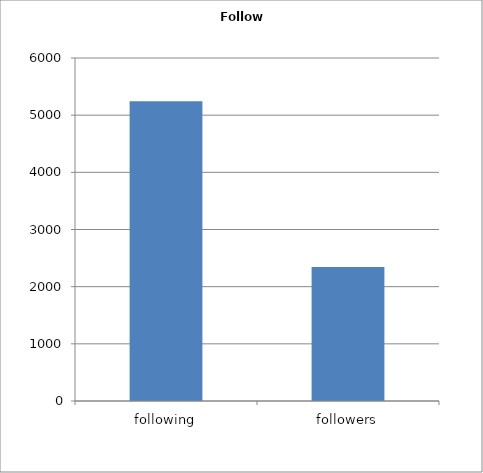
| Category | following |
|---|---|
| following | 5245 |
| followers | 2345 |